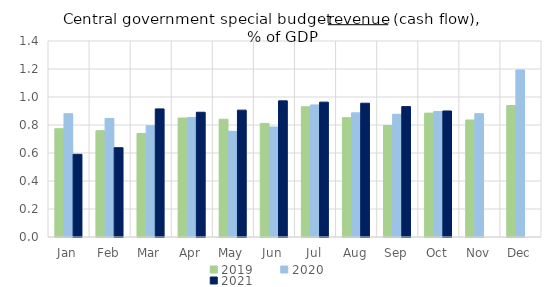
| Category | 2019 | 2020 | 2021 |
|---|---|---|---|
| Jan | 0.773 | 0.88 | 0.591 |
| Feb | 0.759 | 0.847 | 0.638 |
| Mar | 0.739 | 0.794 | 0.915 |
| Apr | 0.85 | 0.854 | 0.891 |
| May | 0.841 | 0.755 | 0.906 |
| Jun | 0.811 | 0.786 | 0.972 |
| Jul | 0.931 | 0.944 | 0.963 |
| Aug | 0.852 | 0.887 | 0.956 |
| Sep | 0.796 | 0.877 | 0.931 |
| Oct | 0.885 | 0.896 | 0.9 |
| Nov | 0.836 | 0.881 | 0 |
| Dec | 0.939 | 1.193 | 0 |